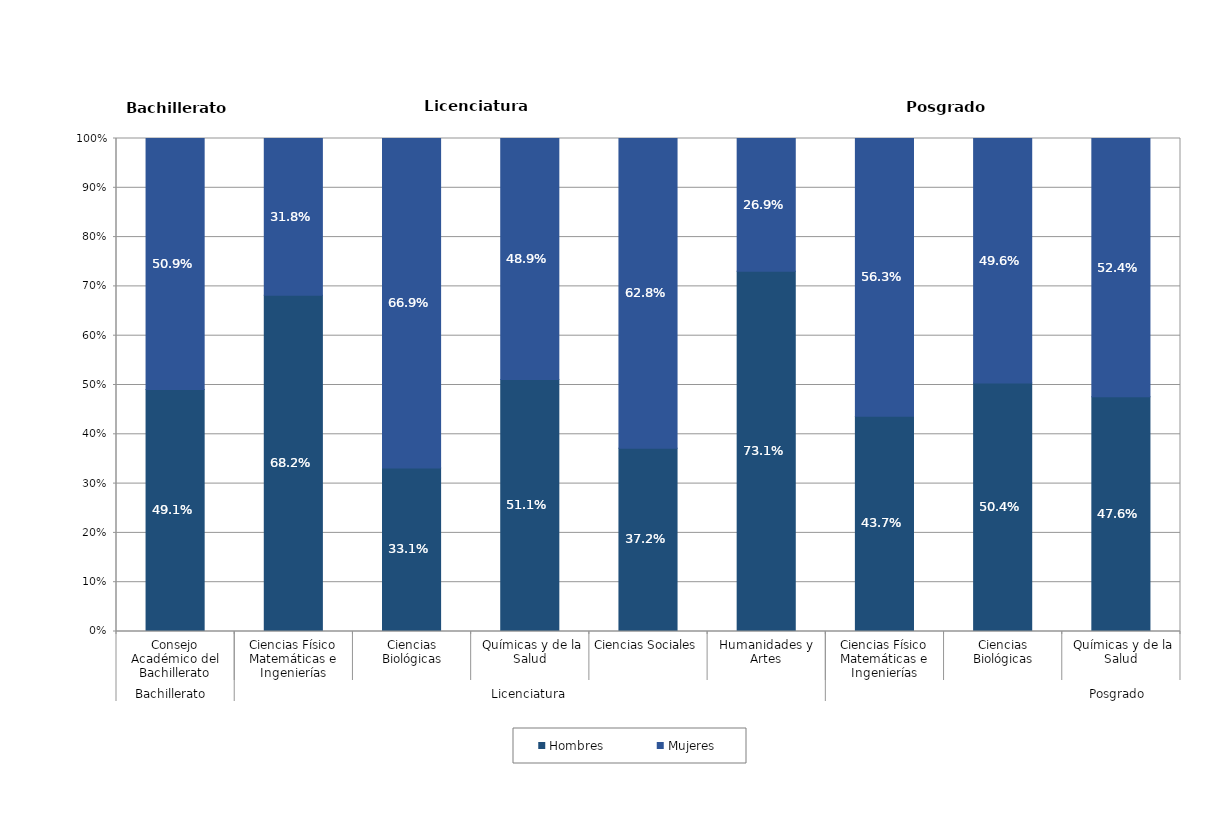
| Category | Hombres | Mujeres |
|---|---|---|
| 0 | 0.491 | 0.509 |
| 1 | 0.682 | 0.318 |
| 2 | 0.331 | 0.669 |
| 3 | 0.511 | 0.489 |
| 4 | 0.372 | 0.628 |
| 5 | 0.731 | 0.269 |
| 6 | 0.437 | 0.563 |
| 7 | 0.504 | 0.496 |
| 8 | 0.476 | 0.524 |